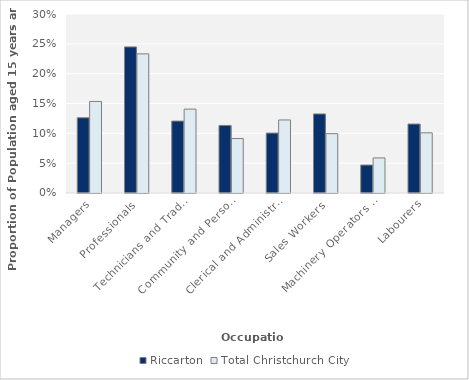
| Category | Riccarton | Total Christchurch City |
|---|---|---|
| Managers | 0.126 | 0.153 |
| Professionals | 0.245 | 0.233 |
| Technicians and Trades Workers | 0.121 | 0.141 |
| Community and Personal Service Workers | 0.113 | 0.091 |
| Clerical and Administrative Workers | 0.1 | 0.122 |
| Sales Workers | 0.132 | 0.099 |
| Machinery Operators and Drivers | 0.047 | 0.059 |
| Labourers | 0.116 | 0.101 |